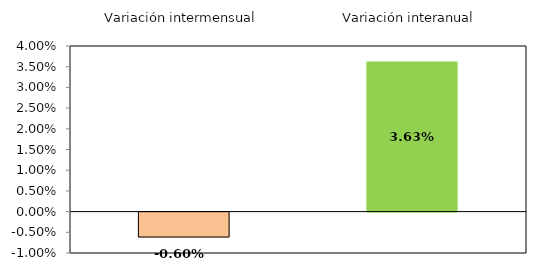
| Category | Series 0 |
|---|---|
| 0 | -0.602 |
| 1 | 3.626 |